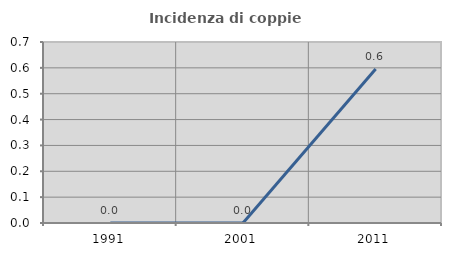
| Category | Incidenza di coppie miste |
|---|---|
| 1991.0 | 0 |
| 2001.0 | 0 |
| 2011.0 | 0.595 |